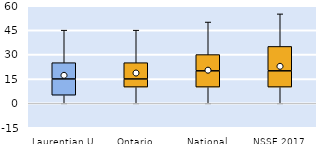
| Category | 25th | 50th | 75th |
|---|---|---|---|
| Laurentian U | 5 | 10 | 10 |
| Ontario | 10 | 5 | 10 |
| National | 10 | 10 | 10 |
| NSSE 2017 | 10 | 10 | 15 |